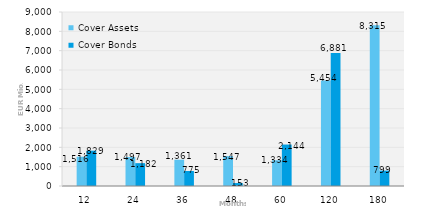
| Category | Cover Assets | Cover Bonds |
|---|---|---|
| 12.0 | 1516.003 | 1828.811 |
| 24.0 | 1497.308 | 1181.613 |
| 36.0 | 1360.522 | 775 |
| 48.0 | 1546.667 | 152.5 |
| 60.0 | 1333.752 | 2144 |
| 120.0 | 5453.918 | 6880.894 |
| 180.0 | 8315.432 | 798.614 |